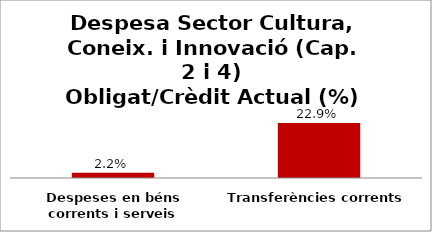
| Category | Series 0 |
|---|---|
| Despeses en béns corrents i serveis | 0.022 |
| Transferències corrents | 0.229 |